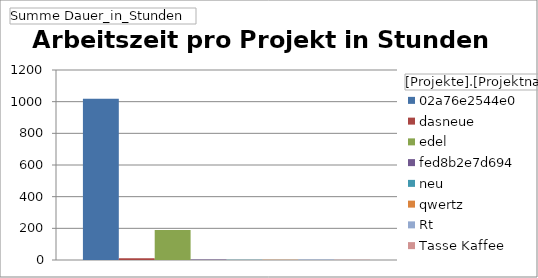
| Category | 02a76e2544e0 | dasneue | edel | fed8b2e7d694 | neu | qwertz | Rt | Tasse Kaffee |
|---|---|---|---|---|---|---|---|---|
| Ergebnis | 1018.776 | 11.019 | 189.7 | 3 | 1 | 2.01 | 3.567 | 1.133 |